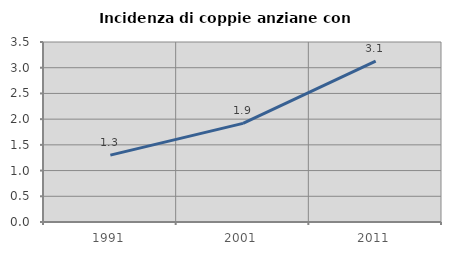
| Category | Incidenza di coppie anziane con figli |
|---|---|
| 1991.0 | 1.3 |
| 2001.0 | 1.917 |
| 2011.0 | 3.128 |